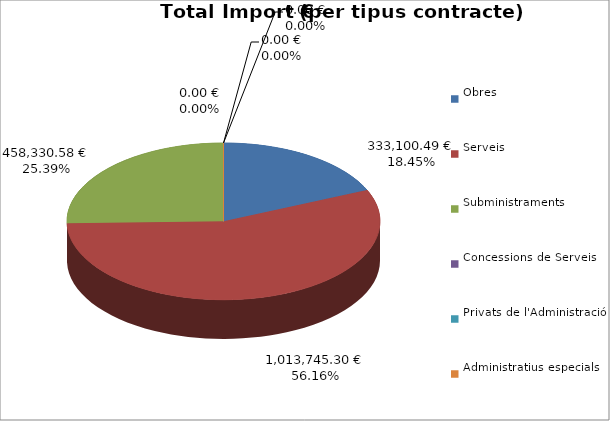
| Category | Total preu
(amb IVA) |
|---|---|
| Obres | 333100.49 |
| Serveis | 1013745.3 |
| Subministraments | 458330.58 |
| Concessions de Serveis | 0 |
| Privats de l'Administració | 0 |
| Administratius especials | 0 |